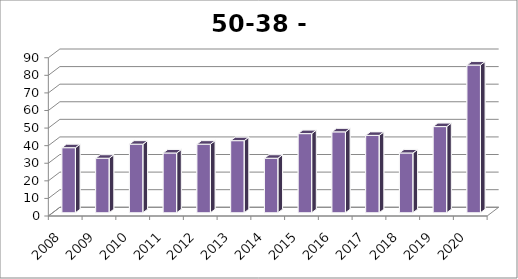
| Category | Hilvarenbeek |
|---|---|
| 2008.0 | 37 |
| 2009.0 | 31 |
| 2010.0 | 39 |
| 2011.0 | 34 |
| 2012.0 | 39 |
| 2013.0 | 41 |
| 2014.0 | 31 |
| 2015.0 | 45 |
| 2016.0 | 46 |
| 2017.0 | 44 |
| 2018.0 | 34 |
| 2019.0 | 49 |
| 2020.0 | 84 |